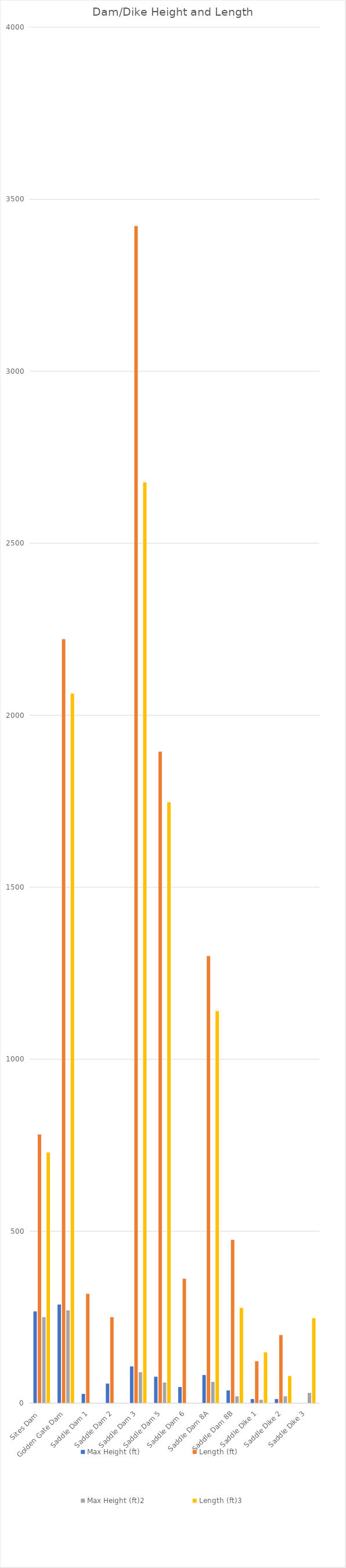
| Category | Max Height (ft) | Length (ft) | Max Height (ft)2 | Length (ft)3 |
|---|---|---|---|---|
| Sites Dam  | 267 | 781 | 250 | 729 |
| Golden Gate Dam | 287 | 2221 | 270 | 2063 |
| Saddle Dam 1 | 27 | 318 | 0 | 0 |
| Saddle Dam 2 | 57 | 250 | 0 | 0 |
| Saddle Dam 3 | 107 | 3422 | 90 | 2677 |
| Saddle Dam 5 | 77 | 1894 | 60 | 1747 |
| Saddle Dam 6 | 47 | 362 | 0 | 0 |
| Saddle Dam 8A | 82 | 1300 | 62 | 1140 |
| Saddle Dam 8B | 37 | 475 | 20 | 277 |
| Saddle Dike 1 | 12 | 122 | 10 | 148 |
| Saddle Dike 2 | 12 | 198 | 20 | 79 |
| Saddle Dike 3 | 0 | 0 | 30 | 247 |